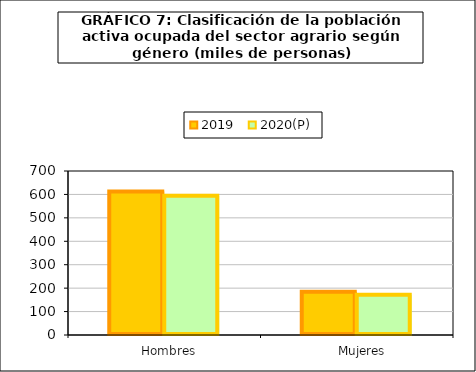
| Category | 2019 | 2020(P) |
|---|---|---|
|    Hombres | 612.3 | 593.875 |
|    Mujeres | 185 | 171.425 |